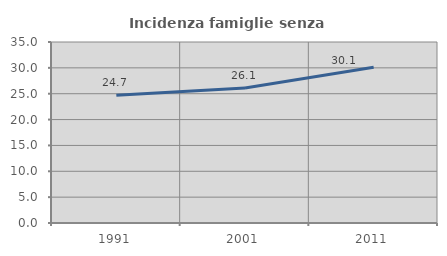
| Category | Incidenza famiglie senza nuclei |
|---|---|
| 1991.0 | 24.681 |
| 2001.0 | 26.104 |
| 2011.0 | 30.107 |